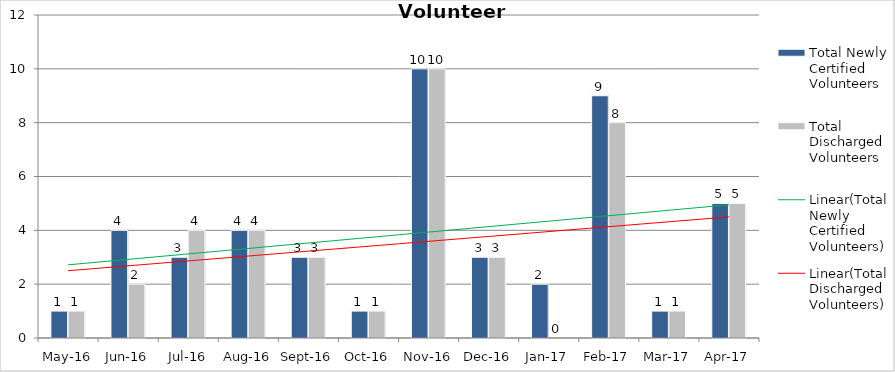
| Category | Total Newly Certified Volunteers | Total Discharged Volunteers |
|---|---|---|
| May-16 | 1 | 1 |
| Jun-16 | 4 | 2 |
| Jul-16 | 3 | 4 |
| Aug-16 | 4 | 4 |
| Sep-16 | 3 | 3 |
| Oct-16 | 1 | 1 |
| Nov-16 | 10 | 10 |
| Dec-16 | 3 | 3 |
| Jan-17 | 2 | 0 |
| Feb-17 | 9 | 8 |
| Mar-17 | 1 | 1 |
| Apr-17 | 5 | 5 |